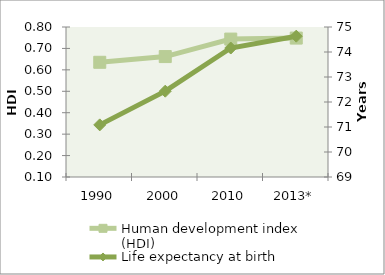
| Category | Human development index (HDI) |
|---|---|
| 1990 | 0.635 |
| 2000 | 0.662 |
| 2010 | 0.744 |
| 2013* | 0.748 |